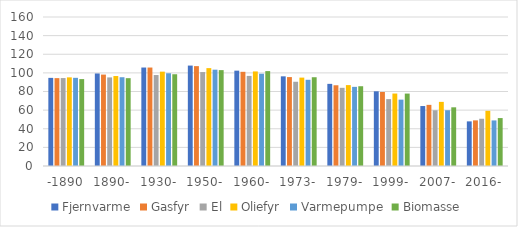
| Category | Fjernvarme | Gasfyr | El | Oliefyr | Varmepumpe | Biomasse |
|---|---|---|---|---|---|---|
| -1890 | 94.633 | 94.356 | 94.43 | 95.187 | 94.685 | 93.325 |
| 1890- | 99.359 | 98.162 | 95.131 | 96.604 | 95.331 | 94.31 |
| 1930- | 105.742 | 105.733 | 97.677 | 101.315 | 99.588 | 98.531 |
| 1950- | 107.838 | 107.242 | 100.872 | 105.104 | 103.43 | 102.958 |
| 1960- | 102.386 | 101.141 | 96.745 | 101.55 | 99.092 | 101.902 |
| 1973- | 96.286 | 95.489 | 90.461 | 94.915 | 92.589 | 95.315 |
| 1979- | 88.205 | 86.698 | 83.949 | 86.873 | 84.988 | 85.657 |
| 1999- | 80.207 | 79.482 | 71.81 | 77.812 | 71.263 | 77.777 |
| 2007- | 64.395 | 65.656 | 59.839 | 68.863 | 59.889 | 63.019 |
| 2016- | 47.92 | 49 | 50.738 | 59.264 | 48.942 | 51.47 |